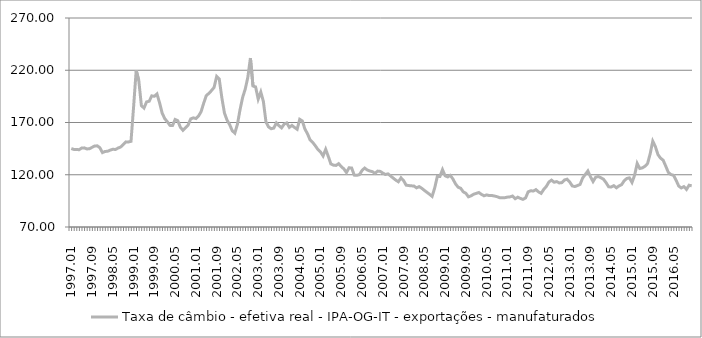
| Category | Taxa de câmbio - efetiva real - IPA-OG-IT - exportações - manufaturados |
|---|---|
| 1997.01 | 145.098 |
| 1997.02 | 144.206 |
| 1997.03 | 144.154 |
| 1997.04 | 143.973 |
| 1997.05 | 145.564 |
| 1997.06 | 145.728 |
| 1997.07 | 144.697 |
| 1997.08 | 144.911 |
| 1997.09 | 146.229 |
| 1997.10 | 147.499 |
| 1997.11 | 147.687 |
| 1997.12 | 145.874 |
| 1998.01 | 141.189 |
| 1998.02 | 142.278 |
| 1998.03 | 142.463 |
| 1998.04 | 143.568 |
| 1998.05 | 144.398 |
| 1998.06 | 144.19 |
| 1998.07 | 145.514 |
| 1998.08 | 146.546 |
| 1998.09 | 148.981 |
| 1998.10 | 151.451 |
| 1998.11 | 151.385 |
| 1998.12 | 151.973 |
| 1999.01 | 184.967 |
| 1999.02 | 219.976 |
| 1999.03 | 210.232 |
| 1999.04 | 186.196 |
| 1999.05 | 183.805 |
| 1999.06 | 189.706 |
| 1999.07 | 190.346 |
| 1999.08 | 195.5 |
| 1999.09 | 195.099 |
| 1999.10 | 197.325 |
| 1999.11 | 188.898 |
| 1999.12 | 179.017 |
| 2000.01 | 173.699 |
| 2000.02 | 170.723 |
| 2000.03 | 167.243 |
| 2000.04 | 167.09 |
| 2000.05 | 172.888 |
| 2000.06 | 171.77 |
| 2000.07 | 165.523 |
| 2000.08 | 162.571 |
| 2000.09 | 165.084 |
| 2000.10 | 167.505 |
| 2000.11 | 173.451 |
| 2000.12 | 174.442 |
| 2001.01 | 173.806 |
| 2001.02 | 176.167 |
| 2001.03 | 180.349 |
| 2001.04 | 188.499 |
| 2001.05 | 195.68 |
| 2001.06 | 197.898 |
| 2001.07 | 200.498 |
| 2001.08 | 203.565 |
| 2001.09 | 214.027 |
| 2001.10 | 211.546 |
| 2001.11 | 193.609 |
| 2001.12 | 179.053 |
| 2002.01 | 172.274 |
| 2002.02 | 167.96 |
| 2002.03 | 162.157 |
| 2002.04 | 159.829 |
| 2002.05 | 168.311 |
| 2002.06 | 182.198 |
| 2002.07 | 193.972 |
| 2002.08 | 201.905 |
| 2002.09 | 213.115 |
| 2002.10 | 231.708 |
| 2002.11 | 204.924 |
| 2002.12 | 204.058 |
| 2003.01 | 192.38 |
| 2003.02 | 199.16 |
| 2003.03 | 190.11 |
| 2003.04 | 170.44 |
| 2003.05 | 165.731 |
| 2003.06 | 164.037 |
| 2003.07 | 164.678 |
| 2003.08 | 169.619 |
| 2003.09 | 166.962 |
| 2003.10 | 164.874 |
| 2003.11 | 168.467 |
| 2003.12 | 169.597 |
| 2004.01 | 165.332 |
| 2004.02 | 167.206 |
| 2004.03 | 165.247 |
| 2004.04 | 163.537 |
| 2004.05 | 173.042 |
| 2004.06 | 171.456 |
| 2004.07 | 163.695 |
| 2004.08 | 159.189 |
| 2004.09 | 153.272 |
| 2004.10 | 151.004 |
| 2004.11 | 147.734 |
| 2004.12 | 144.185 |
| 2005.01 | 141.879 |
| 2005.02 | 137.971 |
| 2005.03 | 144.361 |
| 2005.04 | 137.597 |
| 2005.05 | 130.339 |
| 2005.06 | 129.187 |
| 2005.07 | 128.931 |
| 2005.08 | 130.623 |
| 2005.09 | 127.784 |
| 2005.10 | 125.629 |
| 2005.11 | 122.141 |
| 2005.12 | 126.651 |
| 2006.01 | 126.469 |
| 2006.02 | 119.652 |
| 2006.03 | 119.453 |
| 2006.04 | 120.103 |
| 2006.05 | 124.061 |
| 2006.06 | 126.413 |
| 2006.07 | 124.584 |
| 2006.08 | 123.587 |
| 2006.09 | 122.954 |
| 2006.10 | 121.32 |
| 2006.11 | 123.481 |
| 2006.12 | 123.235 |
| 2007.01 | 121.595 |
| 2007.02 | 120.262 |
| 2007.03 | 120.844 |
| 2007.04 | 118.849 |
| 2007.05 | 116.809 |
| 2007.06 | 114.868 |
| 2007.07 | 113.282 |
| 2007.08 | 117.056 |
| 2007.09 | 114.433 |
| 2007.10 | 110.025 |
| 2007.11 | 109.656 |
| 2007.12 | 109.41 |
| 2008.01 | 109.189 |
| 2008.02 | 107.469 |
| 2008.03 | 108.641 |
| 2008.04 | 107.076 |
| 2008.05 | 105.07 |
| 2008.06 | 103.192 |
| 2008.07 | 101.322 |
| 2008.08 | 99.313 |
| 2008.09 | 107.454 |
| 2008.10 | 118.294 |
| 2008.11 | 118.374 |
| 2008.12 | 124.891 |
| 2009.01 | 119.052 |
| 2009.02 | 117.898 |
| 2009.03 | 119.409 |
| 2009.04 | 116.007 |
| 2009.05 | 111.341 |
| 2009.06 | 108.117 |
| 2009.07 | 107.074 |
| 2009.08 | 103.611 |
| 2009.09 | 102.257 |
| 2009.10 | 98.862 |
| 2009.11 | 99.799 |
| 2009.12 | 101.384 |
| 2010.01 | 102.172 |
| 2010.02 | 103.012 |
| 2010.03 | 101.185 |
| 2010.04 | 99.875 |
| 2010.05 | 100.722 |
| 2010.06 | 100.101 |
| 2010.07 | 100.149 |
| 2010.08 | 99.647 |
| 2010.09 | 99.031 |
| 2010.10 | 98.083 |
| 2010.11 | 97.987 |
| 2010.12 | 98.036 |
| 2011.01 | 98.581 |
| 2011.02 | 98.84 |
| 2011.03 | 99.657 |
| 2011.04 | 97.07 |
| 2011.05 | 98.505 |
| 2011.06 | 97.35 |
| 2011.07 | 96.442 |
| 2011.08 | 97.797 |
| 2011.09 | 103.646 |
| 2011.10 | 104.686 |
| 2011.11 | 104.39 |
| 2011.12 | 105.765 |
| 2012.01 | 103.59 |
| 2012.02 | 102.187 |
| 2012.03 | 105.999 |
| 2012.04 | 108.819 |
| 2012.05 | 113.069 |
| 2012.06 | 114.849 |
| 2012.07 | 112.857 |
| 2012.08 | 113.449 |
| 2012.09 | 112.18 |
| 2012.10 | 112.457 |
| 2012.11 | 115.015 |
| 2012.12 | 115.721 |
| 2013.01 | 113.053 |
| 2013.02 | 109.293 |
| 2013.03 | 108.722 |
| 2013.04 | 109.651 |
| 2013.05 | 110.765 |
| 2013.06 | 116.916 |
| 2013.07 | 120.268 |
| 2013.08 | 123.612 |
| 2013.09 | 118.115 |
| 2013.10 | 113.5 |
| 2013.11 | 117.681 |
| 2013.12 | 118.313 |
| 2014.01 | 117.187 |
| 2014.02 | 115.741 |
| 2014.03 | 112.44 |
| 2014.04 | 108.461 |
| 2014.05 | 108.283 |
| 2014.06 | 109.549 |
| 2014.07 | 107.482 |
| 2014.08 | 109.337 |
| 2014.09 | 110.538 |
| 2014.10 | 114.301 |
| 2014.11 | 116.445 |
| 2014.12 | 117.02 |
| 2015.01 | 112.642 |
| 2015.02 | 119.505 |
| 2015.03 | 130.818 |
| 2015.04 | 125.996 |
| 2015.05 | 126.586 |
| 2015.06 | 128.164 |
| 2015.07 | 130.718 |
| 2015.08 | 140.029 |
| 2015.09 | 152.14 |
| 2015.10 | 147.013 |
| 2015.11 | 139.251 |
| 2015.12 | 135.902 |
| 2016.01 | 133.913 |
| 2016.02 | 128.252 |
| 2016.03 | 122.25 |
| 2016.04 | 120.182 |
| 2016.05 | 119.499 |
| 2016.06 | 114.668 |
| 2016.07 | 109.215 |
| 2016.08 | 107.353 |
| 2016.09 | 108.638 |
| 2016.10 | 105.973 |
| 2016.11 | 109.997 |
| 2016.12 | 109.403 |